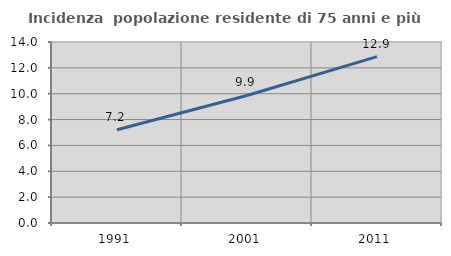
| Category | Incidenza  popolazione residente di 75 anni e più |
|---|---|
| 1991.0 | 7.214 |
| 2001.0 | 9.865 |
| 2011.0 | 12.873 |